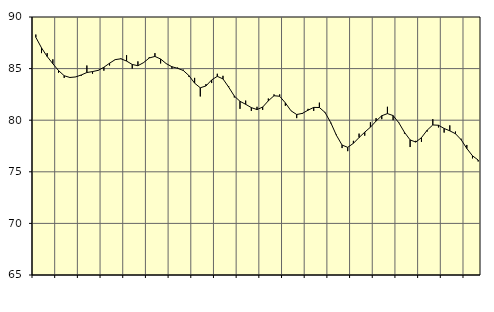
| Category | Piggar | Series 1 |
|---|---|---|
| nan | 88.3 | 88.03 |
| 1.0 | 86.5 | 87.01 |
| 1.0 | 86.5 | 86.17 |
| 1.0 | 85.9 | 85.47 |
| nan | 84.6 | 84.81 |
| 2.0 | 84.1 | 84.31 |
| 2.0 | 84.1 | 84.14 |
| 2.0 | 84.2 | 84.19 |
| nan | 84.3 | 84.38 |
| 3.0 | 85.3 | 84.62 |
| 3.0 | 84.5 | 84.71 |
| 3.0 | 84.8 | 84.83 |
| nan | 84.8 | 85.13 |
| 4.0 | 85.3 | 85.52 |
| 4.0 | 85.9 | 85.87 |
| 4.0 | 86 | 85.95 |
| nan | 86.3 | 85.73 |
| 5.0 | 85 | 85.4 |
| 5.0 | 85.7 | 85.28 |
| 5.0 | 85.6 | 85.58 |
| nan | 86.1 | 86.03 |
| 6.0 | 86.5 | 86.18 |
| 6.0 | 85.5 | 85.93 |
| 6.0 | 85.5 | 85.48 |
| nan | 85 | 85.18 |
| 7.0 | 85.1 | 85.03 |
| 7.0 | 84.9 | 84.82 |
| 7.0 | 84.2 | 84.32 |
| nan | 84.1 | 83.59 |
| 8.0 | 82.3 | 83.14 |
| 8.0 | 83.5 | 83.32 |
| 8.0 | 83.6 | 83.9 |
| nan | 84.5 | 84.25 |
| 9.0 | 84.3 | 84 |
| 9.0 | 83.3 | 83.21 |
| 9.0 | 82.2 | 82.34 |
| nan | 81.1 | 81.83 |
| 10.0 | 81.9 | 81.54 |
| 10.0 | 80.9 | 81.22 |
| 10.0 | 81.3 | 81.03 |
| nan | 81 | 81.27 |
| 11.0 | 82.1 | 81.88 |
| 11.0 | 82.5 | 82.37 |
| 11.0 | 82.5 | 82.32 |
| nan | 81.4 | 81.68 |
| 12.0 | 80.9 | 80.91 |
| 12.0 | 80.2 | 80.55 |
| 12.0 | 80.6 | 80.66 |
| nan | 81.1 | 80.97 |
| 13.0 | 80.9 | 81.24 |
| 13.0 | 81.7 | 81.23 |
| 13.0 | 80.8 | 80.75 |
| nan | 79.7 | 79.77 |
| 14.0 | 78.6 | 78.54 |
| 14.0 | 77.3 | 77.59 |
| 14.0 | 77 | 77.37 |
| nan | 78 | 77.76 |
| 15.0 | 78.7 | 78.32 |
| 15.0 | 78.5 | 78.84 |
| 15.0 | 79.8 | 79.32 |
| nan | 80.2 | 79.92 |
| 16.0 | 80.1 | 80.43 |
| 16.0 | 81.3 | 80.64 |
| 16.0 | 80 | 80.45 |
| nan | 79.8 | 79.76 |
| 17.0 | 78.7 | 78.83 |
| 17.0 | 77.4 | 78.09 |
| 17.0 | 78 | 77.88 |
| nan | 77.9 | 78.31 |
| 18.0 | 78.9 | 79.03 |
| 18.0 | 80.1 | 79.54 |
| 18.0 | 79.3 | 79.51 |
| nan | 78.8 | 79.2 |
| 19.0 | 79.5 | 78.97 |
| 19.0 | 78.9 | 78.69 |
| 19.0 | 78.2 | 78.11 |
| nan | 77.6 | 77.26 |
| 20.0 | 76.3 | 76.55 |
| 20.0 | 76 | 76.14 |